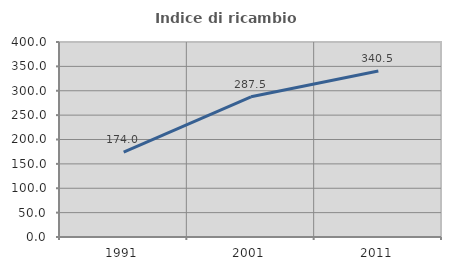
| Category | Indice di ricambio occupazionale  |
|---|---|
| 1991.0 | 173.973 |
| 2001.0 | 287.5 |
| 2011.0 | 340.541 |